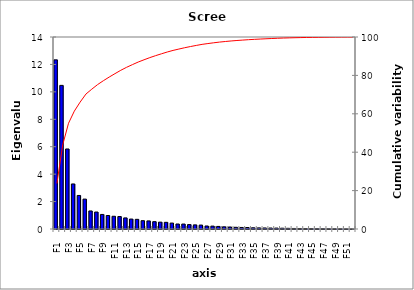
| Category | Eigenvalue |
|---|---|
| F1 | 12.332 |
| F2 | 10.473 |
| F3 | 5.835 |
| F4 | 3.284 |
| F5 | 2.446 |
| F6 | 2.18 |
| F7 | 1.316 |
| F8 | 1.236 |
| F9 | 1.062 |
| F10 | 0.984 |
| F11 | 0.928 |
| F12 | 0.908 |
| F13 | 0.808 |
| F14 | 0.725 |
| F15 | 0.705 |
| F16 | 0.605 |
| F17 | 0.589 |
| F18 | 0.534 |
| F19 | 0.5 |
| F20 | 0.487 |
| F21 | 0.432 |
| F22 | 0.365 |
| F23 | 0.361 |
| F24 | 0.323 |
| F25 | 0.301 |
| F26 | 0.286 |
| F27 | 0.22 |
| F28 | 0.21 |
| F29 | 0.188 |
| F30 | 0.16 |
| F31 | 0.146 |
| F32 | 0.125 |
| F33 | 0.112 |
| F34 | 0.108 |
| F35 | 0.09 |
| F36 | 0.081 |
| F37 | 0.075 |
| F38 | 0.071 |
| F39 | 0.067 |
| F40 | 0.059 |
| F41 | 0.05 |
| F42 | 0.039 |
| F43 | 0.037 |
| F44 | 0.032 |
| F45 | 0.028 |
| F46 | 0.023 |
| F47 | 0.02 |
| F48 | 0.017 |
| F49 | 0.013 |
| F50 | 0.012 |
| F51 | 0.007 |
| F52 | 0.004 |